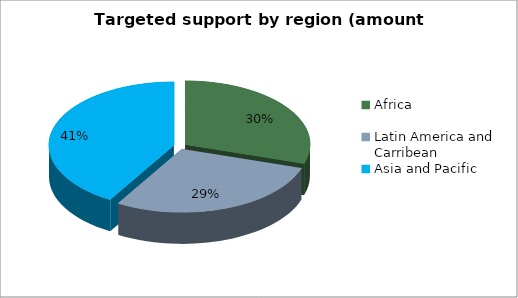
| Category | Series 0 |
|---|---|
| Africa | 1141500 |
| Latin America and  Carribean | 1092512 |
| Asia and Pacific | 1584079 |